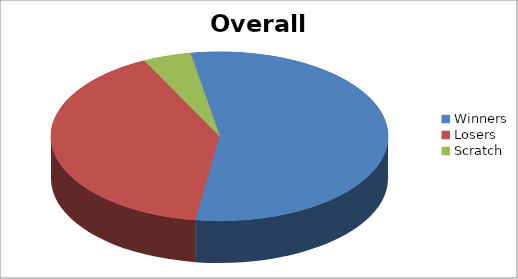
| Category | Series 1 |
|---|---|
| Winners | 60 |
| Losers | 44 |
| Scratch | 5 |